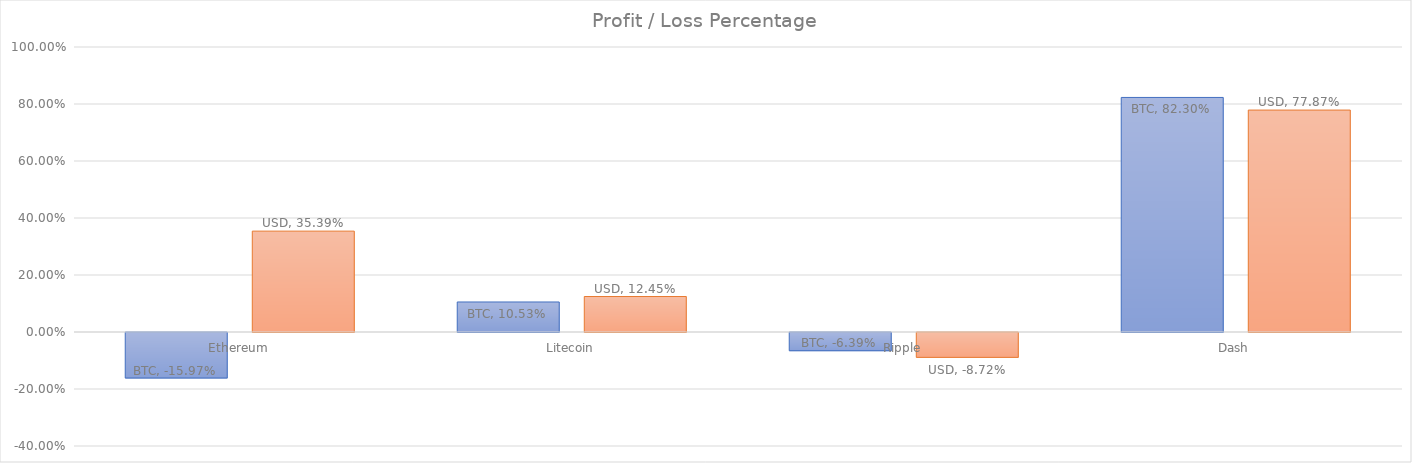
| Category | BTC | USD |
|---|---|---|
| Ethereum | -0.16 | 0.354 |
| Litecoin | 0.105 | 0.124 |
| Ripple | -0.064 | -0.087 |
| Dash | 0.823 | 0.779 |